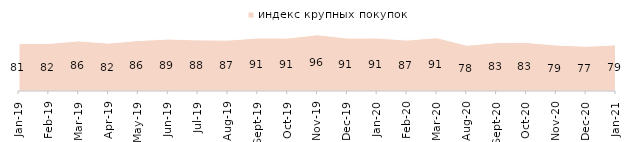
| Category | индекс крупных покупок |
|---|---|
| 2019-01-01 | 81.45 |
| 2019-02-01 | 81.55 |
| 2019-03-01 | 85.828 |
| 2019-04-01 | 81.98 |
| 2019-05-01 | 86.429 |
| 2019-06-01 | 89.027 |
| 2019-07-01 | 87.574 |
| 2019-08-01 | 87.213 |
| 2019-09-01 | 90.842 |
| 2019-10-01 | 90.644 |
| 2019-11-01 | 96.386 |
| 2019-12-01 | 90.644 |
| 2020-01-01 | 90.743 |
| 2020-02-01 | 87.228 |
| 2020-03-01 | 91.373 |
| 2020-08-01 | 78.252 |
| 2020-09-01 | 82.927 |
| 2020-10-01 | 83.109 |
| 2020-11-01 | 78.75 |
| 2020-12-01 | 76.599 |
| 2021-01-01 | 79.136 |